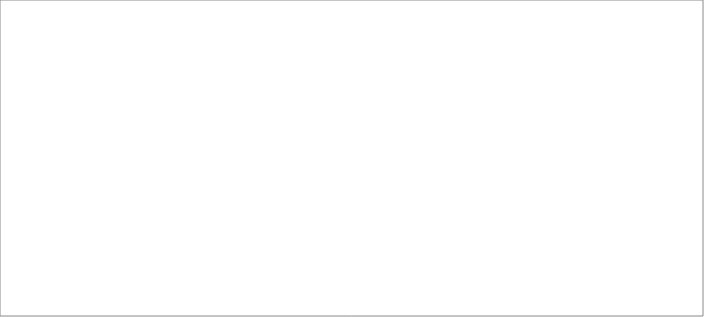
| Category | PreD | PostD |
|---|---|---|
| 0 | 1 | 1 |